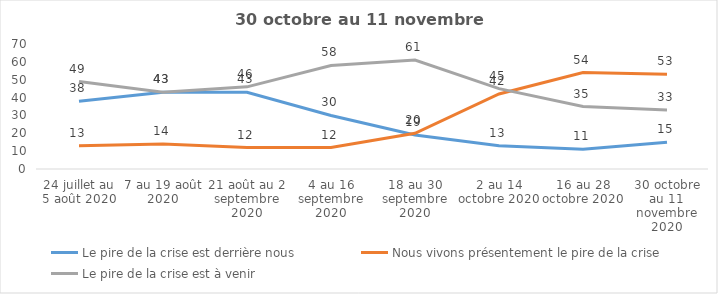
| Category | Le pire de la crise est derrière nous | Nous vivons présentement le pire de la crise | Le pire de la crise est à venir |
|---|---|---|---|
| 24 juillet au 5 août 2020 | 38 | 13 | 49 |
| 7 au 19 août 2020 | 43 | 14 | 43 |
| 21 août au 2 septembre 2020 | 43 | 12 | 46 |
| 4 au 16 septembre 2020 | 30 | 12 | 58 |
| 18 au 30 septembre 2020 | 19 | 20 | 61 |
| 2 au 14 octobre 2020 | 13 | 42 | 45 |
| 16 au 28 octobre 2020 | 11 | 54 | 35 |
| 30 octobre au 11 novembre 2020 | 15 | 53 | 33 |